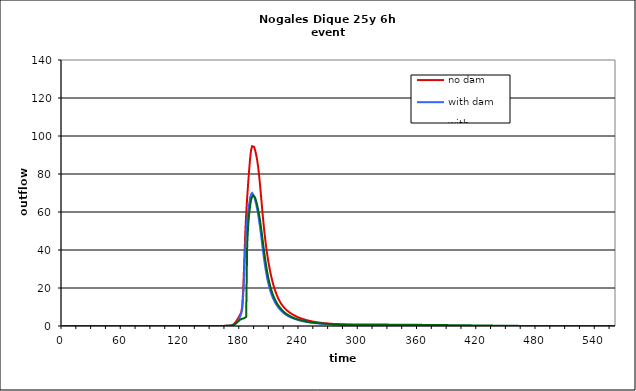
| Category | no dam | with dam | with dam/pond |
|---|---|---|---|
| 0.0 | 0 | 0 | 0 |
| 1.0 | 0 | 0 | 0 |
| 2.0 | 0 | 0 | 0 |
| 3.0 | 0 | 0 | 0 |
| 4.0 | 0 | 0 | 0 |
| 5.0 | 0 | 0 | 0 |
| 6.0 | 0 | 0 | 0 |
| 7.0 | 0 | 0 | 0 |
| 8.0 | 0 | 0 | 0 |
| 9.0 | 0 | 0 | 0 |
| 10.0 | 0 | 0 | 0 |
| 11.0 | 0 | 0 | 0 |
| 12.0 | 0 | 0 | 0 |
| 13.0 | 0 | 0 | 0 |
| 14.0 | 0 | 0 | 0 |
| 15.0 | 0 | 0 | 0 |
| 16.0 | 0 | 0 | 0 |
| 17.0 | 0 | 0 | 0 |
| 18.0 | 0 | 0 | 0 |
| 19.0 | 0 | 0 | 0 |
| 20.0 | 0 | 0 | 0 |
| 21.0 | 0 | 0 | 0 |
| 22.0 | 0 | 0 | 0 |
| 23.0 | 0 | 0 | 0 |
| 24.0 | 0 | 0 | 0 |
| 25.0 | 0 | 0 | 0 |
| 26.0 | 0 | 0 | 0 |
| 27.0 | 0 | 0 | 0 |
| 28.0 | 0 | 0 | 0 |
| 29.0 | 0 | 0 | 0 |
| 30.0 | 0 | 0 | 0 |
| 31.0 | 0 | 0 | 0 |
| 32.0 | 0 | 0 | 0 |
| 33.0 | 0 | 0 | 0 |
| 34.0 | 0 | 0 | 0 |
| 35.0 | 0 | 0 | 0 |
| 36.0 | 0 | 0 | 0 |
| 37.0 | 0 | 0 | 0 |
| 38.0 | 0 | 0 | 0 |
| 39.0 | 0 | 0 | 0 |
| 40.0 | 0 | 0 | 0 |
| 41.0 | 0 | 0 | 0 |
| 42.0 | 0 | 0 | 0 |
| 43.0 | 0 | 0 | 0 |
| 44.0 | 0 | 0 | 0 |
| 45.0 | 0 | 0 | 0 |
| 46.0 | 0 | 0 | 0 |
| 47.0 | 0 | 0 | 0 |
| 48.0 | 0 | 0 | 0 |
| 49.0 | 0 | 0 | 0 |
| 50.0 | 0 | 0 | 0 |
| 51.0 | 0 | 0 | 0 |
| 52.0 | 0 | 0 | 0 |
| 53.0 | 0 | 0 | 0 |
| 54.0 | 0 | 0 | 0 |
| 55.0 | 0 | 0 | 0 |
| 56.0 | 0 | 0 | 0 |
| 57.0 | 0 | 0 | 0 |
| 58.0 | 0 | 0 | 0 |
| 59.0 | 0 | 0 | 0 |
| 60.0 | 0 | 0 | 0 |
| 61.0 | 0 | 0 | 0 |
| 62.0 | 0 | 0 | 0 |
| 63.0 | 0 | 0 | 0 |
| 64.0 | 0 | 0 | 0 |
| 65.0 | 0 | 0 | 0 |
| 66.0 | 0 | 0 | 0 |
| 67.0 | 0 | 0 | 0 |
| 68.0 | 0 | 0 | 0 |
| 69.0 | 0 | 0 | 0 |
| 70.0 | 0 | 0 | 0 |
| 71.0 | 0 | 0 | 0 |
| 72.0 | 0 | 0 | 0 |
| 73.0 | 0 | 0 | 0 |
| 74.0 | 0 | 0 | 0 |
| 75.0 | 0 | 0 | 0 |
| 76.0 | 0 | 0 | 0 |
| 77.0 | 0 | 0 | 0 |
| 78.0 | 0 | 0 | 0 |
| 79.0 | 0 | 0 | 0 |
| 80.0 | 0 | 0 | 0 |
| 81.0 | 0 | 0 | 0 |
| 82.0 | 0 | 0 | 0 |
| 83.0 | 0 | 0 | 0 |
| 84.0 | 0 | 0 | 0 |
| 85.0 | 0 | 0 | 0 |
| 86.0 | 0 | 0 | 0 |
| 87.0 | 0 | 0 | 0 |
| 88.0 | 0 | 0 | 0 |
| 89.0 | 0 | 0 | 0 |
| 90.0 | 0 | 0 | 0 |
| 91.0 | 0 | 0 | 0 |
| 92.0 | 0 | 0 | 0 |
| 93.0 | 0 | 0 | 0 |
| 94.0 | 0 | 0 | 0 |
| 95.0 | 0 | 0 | 0 |
| 96.0 | 0 | 0 | 0 |
| 97.0 | 0 | 0 | 0 |
| 98.0 | 0 | 0 | 0 |
| 99.0 | 0 | 0 | 0 |
| 100.0 | 0 | 0 | 0 |
| 101.0 | 0 | 0 | 0 |
| 102.0 | 0 | 0 | 0 |
| 103.0 | 0 | 0 | 0 |
| 104.0 | 0 | 0 | 0 |
| 105.0 | 0 | 0 | 0 |
| 106.0 | 0 | 0 | 0 |
| 107.0 | 0 | 0 | 0 |
| 108.0 | 0 | 0 | 0 |
| 109.0 | 0 | 0 | 0 |
| 110.0 | 0 | 0 | 0 |
| 111.0 | 0 | 0 | 0 |
| 112.0 | 0 | 0 | 0 |
| 113.0 | 0 | 0 | 0 |
| 114.0 | 0 | 0 | 0 |
| 115.0 | 0 | 0 | 0 |
| 116.0 | 0 | 0 | 0 |
| 117.0 | 0 | 0 | 0 |
| 118.0 | 0 | 0 | 0 |
| 119.0 | 0 | 0 | 0 |
| 120.0 | 0 | 0 | 0 |
| 121.0 | 0 | 0 | 0 |
| 122.0 | 0 | 0 | 0 |
| 123.0 | 0 | 0 | 0 |
| 124.0 | 0 | 0 | 0 |
| 125.0 | 0 | 0 | 0 |
| 126.0 | 0 | 0 | 0 |
| 127.0 | 0 | 0 | 0 |
| 128.0 | 0 | 0 | 0 |
| 129.0 | 0 | 0 | 0 |
| 130.0 | 0 | 0 | 0 |
| 131.0 | 0 | 0 | 0 |
| 132.0 | 0 | 0 | 0 |
| 133.0 | 0 | 0 | 0 |
| 134.0 | 0 | 0 | 0 |
| 135.0 | 0 | 0 | 0 |
| 136.0 | 0 | 0 | 0 |
| 137.0 | 0 | 0 | 0 |
| 138.0 | 0 | 0 | 0 |
| 139.0 | 0 | 0 | 0 |
| 140.0 | 0 | 0 | 0 |
| 141.0 | 0 | 0 | 0 |
| 142.0 | 0 | 0 | 0 |
| 143.0 | 0 | 0 | 0 |
| 144.0 | 0 | 0 | 0 |
| 145.0 | 0.001 | 0 | 0 |
| 146.0 | 0.001 | 0 | 0 |
| 147.0 | 0.001 | 0 | 0 |
| 148.0 | 0.002 | 0 | 0 |
| 149.0 | 0.003 | 0 | 0 |
| 150.0 | 0.003 | 0.001 | 0.001 |
| 151.0 | 0.005 | 0.001 | 0.001 |
| 152.0 | 0.006 | 0.001 | 0.001 |
| 153.0 | 0.008 | 0.002 | 0.002 |
| 154.0 | 0.011 | 0.003 | 0.003 |
| 155.0 | 0.013 | 0.004 | 0.004 |
| 156.0 | 0.017 | 0.005 | 0.005 |
| 157.0 | 0.021 | 0.007 | 0.007 |
| 158.0 | 0.025 | 0.009 | 0.009 |
| 159.0 | 0.029 | 0.012 | 0.012 |
| 160.0 | 0.034 | 0.015 | 0.015 |
| 161.0 | 0.04 | 0.019 | 0.019 |
| 162.0 | 0.048 | 0.024 | 0.024 |
| 163.0 | 0.059 | 0.032 | 0.032 |
| 164.0 | 0.073 | 0.041 | 0.041 |
| 165.0 | 0.09 | 0.053 | 0.053 |
| 166.0 | 0.11 | 0.068 | 0.068 |
| 167.0 | 0.135 | 0.085 | 0.085 |
| 168.0 | 0.164 | 0.105 | 0.105 |
| 169.0 | 0.196 | 0.127 | 0.127 |
| 170.0 | 0.232 | 0.151 | 0.151 |
| 171.0 | 0.305 | 0.199 | 0.198 |
| 172.0 | 0.472 | 0.303 | 0.302 |
| 173.0 | 0.782 | 0.482 | 0.48 |
| 174.0 | 1.265 | 0.753 | 0.738 |
| 175.0 | 1.886 | 1.13 | 1.086 |
| 176.0 | 2.583 | 1.608 | 1.513 |
| 177.0 | 3.363 | 2.16 | 1.986 |
| 178.0 | 4.226 | 2.829 | 2.483 |
| 179.0 | 5.14 | 3.818 | 2.969 |
| 180.0 | 6.116 | 5.204 | 3.37 |
| 181.0 | 6.999 | 6.637 | 3.648 |
| 182.0 | 10.349 | 9.035 | 3.838 |
| 183.0 | 18.929 | 16.034 | 3.978 |
| 184.0 | 32.876 | 27.003 | 4.081 |
| 185.0 | 47.768 | 40.527 | 4.071 |
| 186.0 | 58.897 | 49.934 | 4.829 |
| 187.0 | 67.423 | 55.668 | 42.446 |
| 188.0 | 74.99 | 60.136 | 52.744 |
| 189.0 | 82.029 | 64.124 | 58.798 |
| 190.0 | 88.201 | 67.394 | 63.308 |
| 191.0 | 92.567 | 69.394 | 66.426 |
| 192.0 | 94.669 | 70.03 | 68.092 |
| 193.0 | 95.088 | 69.653 | 68.709 |
| 194.0 | 94.289 | 68.478 | 68.522 |
| 195.0 | 92.58 | 66.613 | 67.547 |
| 196.0 | 90.428 | 64.378 | 65.927 |
| 197.0 | 87.739 | 61.942 | 63.901 |
| 198.0 | 84.241 | 59.161 | 61.549 |
| 199.0 | 79.788 | 55.914 | 58.773 |
| 200.0 | 74.496 | 52.212 | 55.582 |
| 201.0 | 68.692 | 48.145 | 51.98 |
| 202.0 | 62.762 | 43.901 | 48.006 |
| 203.0 | 57.043 | 39.705 | 43.917 |
| 204.0 | 51.758 | 35.734 | 39.892 |
| 205.0 | 46.965 | 32.092 | 36.054 |
| 206.0 | 42.663 | 28.821 | 32.527 |
| 207.0 | 38.818 | 25.929 | 29.318 |
| 208.0 | 35.379 | 23.393 | 26.451 |
| 209.0 | 32.29 | 21.191 | 23.943 |
| 210.0 | 29.51 | 19.275 | 21.714 |
| 211.0 | 26.995 | 17.603 | 19.796 |
| 212.0 | 24.719 | 16.13 | 18.107 |
| 213.0 | 22.663 | 14.826 | 16.575 |
| 214.0 | 20.809 | 13.673 | 15.245 |
| 215.0 | 19.135 | 12.647 | 14.096 |
| 216.0 | 17.626 | 11.731 | 13.048 |
| 217.0 | 16.268 | 10.908 | 12.083 |
| 218.0 | 15.047 | 10.159 | 11.231 |
| 219.0 | 13.957 | 9.473 | 10.481 |
| 220.0 | 12.978 | 8.842 | 9.806 |
| 221.0 | 12.098 | 8.261 | 9.18 |
| 222.0 | 11.306 | 7.728 | 8.575 |
| 223.0 | 10.591 | 7.238 | 8 |
| 224.0 | 9.946 | 6.791 | 7.484 |
| 225.0 | 9.362 | 6.382 | 7.029 |
| 226.0 | 8.83 | 6.009 | 6.622 |
| 227.0 | 8.344 | 5.669 | 6.254 |
| 228.0 | 7.896 | 5.359 | 5.92 |
| 229.0 | 7.482 | 5.076 | 5.614 |
| 230.0 | 7.097 | 4.817 | 5.331 |
| 231.0 | 6.737 | 4.577 | 5.045 |
| 232.0 | 6.398 | 4.352 | 4.767 |
| 233.0 | 6.079 | 4.141 | 4.516 |
| 234.0 | 5.779 | 3.942 | 4.291 |
| 235.0 | 5.497 | 3.753 | 4.086 |
| 236.0 | 5.231 | 3.574 | 3.896 |
| 237.0 | 4.982 | 3.403 | 3.719 |
| 238.0 | 4.747 | 3.242 | 3.552 |
| 239.0 | 4.526 | 3.089 | 3.394 |
| 240.0 | 4.318 | 2.944 | 3.245 |
| 241.0 | 4.122 | 2.807 | 3.104 |
| 242.0 | 3.936 | 2.678 | 2.969 |
| 243.0 | 3.759 | 2.556 | 2.842 |
| 244.0 | 3.59 | 2.441 | 2.722 |
| 245.0 | 3.43 | 2.332 | 2.608 |
| 246.0 | 3.277 | 2.23 | 2.5 |
| 247.0 | 3.131 | 2.135 | 2.397 |
| 248.0 | 2.993 | 2.045 | 2.296 |
| 249.0 | 2.861 | 1.963 | 2.197 |
| 250.0 | 2.736 | 1.886 | 2.103 |
| 251.0 | 2.617 | 1.814 | 2.016 |
| 252.0 | 2.503 | 1.746 | 1.938 |
| 253.0 | 2.395 | 1.68 | 1.865 |
| 254.0 | 2.293 | 1.618 | 1.798 |
| 255.0 | 2.198 | 1.559 | 1.734 |
| 256.0 | 2.109 | 1.503 | 1.674 |
| 257.0 | 2.026 | 1.451 | 1.617 |
| 258.0 | 1.948 | 1.401 | 1.564 |
| 259.0 | 1.873 | 1.353 | 1.513 |
| 260.0 | 1.803 | 1.308 | 1.464 |
| 261.0 | 1.736 | 1.266 | 1.418 |
| 262.0 | 1.672 | 1.225 | 1.374 |
| 263.0 | 1.611 | 1.185 | 1.332 |
| 264.0 | 1.553 | 1.147 | 1.292 |
| 265.0 | 1.498 | 1.111 | 1.253 |
| 266.0 | 1.445 | 1.075 | 1.216 |
| 267.0 | 1.395 | 1.041 | 1.18 |
| 268.0 | 1.347 | 1.008 | 1.145 |
| 269.0 | 1.302 | 0.976 | 1.112 |
| 270.0 | 1.258 | 0.945 | 1.079 |
| 271.0 | 1.216 | 0.916 | 1.048 |
| 272.0 | 1.176 | 0.888 | 1.019 |
| 273.0 | 1.137 | 0.86 | 0.99 |
| 274.0 | 1.099 | 0.834 | 0.962 |
| 275.0 | 1.063 | 0.809 | 0.935 |
| 276.0 | 1.028 | 0.785 | 0.91 |
| 277.0 | 0.994 | 0.761 | 0.889 |
| 278.0 | 0.962 | 0.739 | 0.873 |
| 279.0 | 0.93 | 0.717 | 0.862 |
| 280.0 | 0.9 | 0.696 | 0.856 |
| 281.0 | 0.871 | 0.676 | 0.852 |
| 282.0 | 0.842 | 0.656 | 0.849 |
| 283.0 | 0.815 | 0.637 | 0.847 |
| 284.0 | 0.789 | 0.619 | 0.845 |
| 285.0 | 0.764 | 0.601 | 0.842 |
| 286.0 | 0.739 | 0.583 | 0.84 |
| 287.0 | 0.716 | 0.566 | 0.838 |
| 288.0 | 0.693 | 0.55 | 0.836 |
| 289.0 | 0.671 | 0.534 | 0.833 |
| 290.0 | 0.65 | 0.519 | 0.831 |
| 291.0 | 0.63 | 0.505 | 0.829 |
| 292.0 | 0.611 | 0.491 | 0.826 |
| 293.0 | 0.592 | 0.477 | 0.824 |
| 294.0 | 0.573 | 0.464 | 0.821 |
| 295.0 | 0.556 | 0.451 | 0.819 |
| 296.0 | 0.539 | 0.439 | 0.816 |
| 297.0 | 0.522 | 0.427 | 0.814 |
| 298.0 | 0.506 | 0.416 | 0.811 |
| 299.0 | 0.491 | 0.404 | 0.809 |
| 300.0 | 0.476 | 0.393 | 0.806 |
| 301.0 | 0.462 | 0.383 | 0.803 |
| 302.0 | 0.448 | 0.372 | 0.801 |
| 303.0 | 0.434 | 0.363 | 0.798 |
| 304.0 | 0.422 | 0.353 | 0.796 |
| 305.0 | 0.409 | 0.344 | 0.793 |
| 306.0 | 0.397 | 0.335 | 0.79 |
| 307.0 | 0.385 | 0.326 | 0.788 |
| 308.0 | 0.374 | 0.318 | 0.785 |
| 309.0 | 0.363 | 0.31 | 0.783 |
| 310.0 | 0.353 | 0.302 | 0.78 |
| 311.0 | 0.342 | 0.294 | 0.777 |
| 312.0 | 0.333 | 0.287 | 0.775 |
| 313.0 | 0.323 | 0.28 | 0.772 |
| 314.0 | 0.314 | 0.273 | 0.77 |
| 315.0 | 0.305 | 0.266 | 0.767 |
| 316.0 | 0.296 | 0.259 | 0.764 |
| 317.0 | 0.288 | 0.253 | 0.762 |
| 318.0 | 0.28 | 0.247 | 0.759 |
| 319.0 | 0.272 | 0.241 | 0.756 |
| 320.0 | 0.264 | 0.235 | 0.753 |
| 321.0 | 0.257 | 0.229 | 0.75 |
| 322.0 | 0.25 | 0.224 | 0.747 |
| 323.0 | 0.243 | 0.219 | 0.745 |
| 324.0 | 0.236 | 0.213 | 0.742 |
| 325.0 | 0.23 | 0.208 | 0.739 |
| 326.0 | 0.223 | 0.203 | 0.736 |
| 327.0 | 0.217 | 0.199 | 0.733 |
| 328.0 | 0.211 | 0.194 | 0.73 |
| 329.0 | 0.206 | 0.19 | 0.726 |
| 330.0 | 0.2 | 0.185 | 0.723 |
| 331.0 | 0.195 | 0.181 | 0.72 |
| 332.0 | 0.189 | 0.177 | 0.717 |
| 333.0 | 0.184 | 0.173 | 0.714 |
| 334.0 | 0.179 | 0.169 | 0.711 |
| 335.0 | 0.175 | 0.165 | 0.707 |
| 336.0 | 0.17 | 0.161 | 0.704 |
| 337.0 | 0.166 | 0.158 | 0.701 |
| 338.0 | 0.161 | 0.154 | 0.697 |
| 339.0 | 0.157 | 0.151 | 0.694 |
| 340.0 | 0.153 | 0.148 | 0.691 |
| 341.0 | 0.149 | 0.145 | 0.687 |
| 342.0 | 0.145 | 0.142 | 0.684 |
| 343.0 | 0.141 | 0.139 | 0.68 |
| 344.0 | 0.137 | 0.136 | 0.677 |
| 345.0 | 0.134 | 0.133 | 0.673 |
| 346.0 | 0.13 | 0.13 | 0.669 |
| 347.0 | 0.127 | 0.128 | 0.666 |
| 348.0 | 0.124 | 0.125 | 0.662 |
| 349.0 | 0.121 | 0.122 | 0.658 |
| 350.0 | 0.118 | 0.12 | 0.654 |
| 351.0 | 0.115 | 0.118 | 0.65 |
| 352.0 | 0.112 | 0.115 | 0.646 |
| 353.0 | 0.109 | 0.113 | 0.642 |
| 354.0 | 0.106 | 0.111 | 0.637 |
| 355.0 | 0.103 | 0.109 | 0.633 |
| 356.0 | 0.101 | 0.106 | 0.628 |
| 357.0 | 0.098 | 0.104 | 0.624 |
| 358.0 | 0.096 | 0.102 | 0.619 |
| 359.0 | 0.094 | 0.101 | 0.615 |
| 360.0 | 0.091 | 0.099 | 0.61 |
| 361.0 | 0.089 | 0.097 | 0.606 |
| 362.0 | 0.087 | 0.095 | 0.601 |
| 363.0 | 0.085 | 0.093 | 0.597 |
| 364.0 | 0.083 | 0.092 | 0.592 |
| 365.0 | 0.081 | 0.09 | 0.587 |
| 366.0 | 0.079 | 0.088 | 0.583 |
| 367.0 | 0.077 | 0.087 | 0.578 |
| 368.0 | 0.075 | 0.085 | 0.573 |
| 369.0 | 0.073 | 0.084 | 0.568 |
| 370.0 | 0.071 | 0.082 | 0.564 |
| 371.0 | 0.07 | 0.081 | 0.559 |
| 372.0 | 0.068 | 0.079 | 0.554 |
| 373.0 | 0.066 | 0.078 | 0.549 |
| 374.0 | 0.065 | 0.077 | 0.545 |
| 375.0 | 0.063 | 0.075 | 0.54 |
| 376.0 | 0.062 | 0.074 | 0.535 |
| 377.0 | 0.06 | 0.073 | 0.53 |
| 378.0 | 0.059 | 0.072 | 0.525 |
| 379.0 | 0.058 | 0.07 | 0.52 |
| 380.0 | 0.056 | 0.069 | 0.515 |
| 381.0 | 0.055 | 0.068 | 0.51 |
| 382.0 | 0.054 | 0.067 | 0.505 |
| 383.0 | 0.052 | 0.066 | 0.5 |
| 384.0 | 0.051 | 0.065 | 0.495 |
| 385.0 | 0.05 | 0.064 | 0.49 |
| 386.0 | 0.049 | 0.063 | 0.485 |
| 387.0 | 0.048 | 0.062 | 0.48 |
| 388.0 | 0.047 | 0.061 | 0.474 |
| 389.0 | 0.046 | 0.06 | 0.469 |
| 390.0 | 0.045 | 0.059 | 0.463 |
| 391.0 | 0.044 | 0.058 | 0.458 |
| 392.0 | 0.043 | 0.057 | 0.452 |
| 393.0 | 0.042 | 0.057 | 0.447 |
| 394.0 | 0.041 | 0.056 | 0.441 |
| 395.0 | 0.04 | 0.055 | 0.435 |
| 396.0 | 0.039 | 0.054 | 0.43 |
| 397.0 | 0.038 | 0.053 | 0.424 |
| 398.0 | 0.037 | 0.053 | 0.419 |
| 399.0 | 0.037 | 0.052 | 0.413 |
| 400.0 | 0.036 | 0.051 | 0.407 |
| 401.0 | 0.035 | 0.05 | 0.402 |
| 402.0 | 0.034 | 0.05 | 0.396 |
| 403.0 | 0.034 | 0.049 | 0.39 |
| 404.0 | 0.033 | 0.048 | 0.384 |
| 405.0 | 0.032 | 0.047 | 0.379 |
| 406.0 | 0.031 | 0.047 | 0.373 |
| 407.0 | 0.031 | 0.046 | 0.367 |
| 408.0 | 0.03 | 0.045 | 0.362 |
| 409.0 | 0.03 | 0.045 | 0.356 |
| 410.0 | 0.029 | 0.044 | 0.35 |
| 411.0 | 0.028 | 0.044 | 0.344 |
| 412.0 | 0.028 | 0.043 | 0.339 |
| 413.0 | 0.027 | 0.042 | 0.333 |
| 414.0 | 0.027 | 0.042 | 0.327 |
| 415.0 | 0.026 | 0.041 | 0.321 |
| 416.0 | 0.025 | 0.041 | 0.316 |
| 417.0 | 0.025 | 0.04 | 0.31 |
| 418.0 | 0.024 | 0.04 | 0.304 |
| 419.0 | 0.024 | 0.039 | 0.298 |
| 420.0 | 0.023 | 0.038 | 0.292 |
| 421.0 | 0.023 | 0.038 | 0.285 |
| 422.0 | 0.022 | 0.037 | 0.279 |
| 423.0 | 0.022 | 0.037 | 0.273 |
| 424.0 | 0.021 | 0.036 | 0.267 |
| 425.0 | 0.021 | 0.036 | 0.261 |
| 426.0 | 0.021 | 0.036 | 0.255 |
| 427.0 | 0.02 | 0.035 | 0.249 |
| 428.0 | 0.02 | 0.035 | 0.243 |
| 429.0 | 0.019 | 0.034 | 0.237 |
| 430.0 | 0.019 | 0.034 | 0.231 |
| 431.0 | 0.018 | 0.033 | 0.225 |
| 432.0 | 0.018 | 0.033 | 0.22 |
| 433.0 | 0.018 | 0.033 | 0.214 |
| 434.0 | 0.017 | 0.032 | 0.208 |
| 435.0 | 0.017 | 0.032 | 0.202 |
| 436.0 | 0.017 | 0.031 | 0.197 |
| 437.0 | 0.016 | 0.031 | 0.191 |
| 438.0 | 0.016 | 0.031 | 0.186 |
| 439.0 | 0.016 | 0.03 | 0.18 |
| 440.0 | 0.015 | 0.03 | 0.175 |
| 441.0 | 0.015 | 0.03 | 0.169 |
| 442.0 | 0.015 | 0.029 | 0.164 |
| 443.0 | 0.014 | 0.029 | 0.158 |
| 444.0 | 0.014 | 0.028 | 0.152 |
| 445.0 | 0.014 | 0.028 | 0.146 |
| 446.0 | 0.013 | 0.028 | 0.14 |
| 447.0 | 0.013 | 0.027 | 0.134 |
| 448.0 | 0.013 | 0.027 | 0.128 |
| 449.0 | 0.012 | 0.027 | 0.122 |
| 450.0 | 0.012 | 0.026 | 0.116 |
| 451.0 | 0.012 | 0.026 | 0.11 |
| 452.0 | 0.011 | 0.026 | 0.105 |
| 453.0 | 0.011 | 0.025 | 0.099 |
| 454.0 | 0.011 | 0.025 | 0.094 |
| 455.0 | 0.01 | 0.025 | 0.089 |
| 456.0 | 0.01 | 0.024 | 0.085 |
| 457.0 | 0.01 | 0.024 | 0.08 |
| 458.0 | 0.01 | 0.024 | 0.076 |
| 459.0 | 0.009 | 0.023 | 0.073 |
| 460.0 | 0.009 | 0.023 | 0.069 |
| 461.0 | 0.009 | 0.022 | 0.066 |
| 462.0 | 0.009 | 0.022 | 0.063 |
| 463.0 | 0.008 | 0.022 | 0.06 |
| 464.0 | 0.008 | 0.021 | 0.057 |
| 465.0 | 0.008 | 0.021 | 0.054 |
| 466.0 | 0.008 | 0.02 | 0.052 |
| 467.0 | 0.007 | 0.02 | 0.05 |
| 468.0 | 0.007 | 0.02 | 0.047 |
| 469.0 | 0.007 | 0.019 | 0.045 |
| 470.0 | 0.007 | 0.019 | 0.043 |
| 471.0 | 0.006 | 0.018 | 0.041 |
| 472.0 | 0.006 | 0.018 | 0.04 |
| 473.0 | 0.006 | 0.018 | 0.038 |
| 474.0 | 0.006 | 0.017 | 0.036 |
| 475.0 | 0.005 | 0.017 | 0.035 |
| 476.0 | 0.005 | 0.016 | 0.034 |
| 477.0 | 0.005 | 0.016 | 0.032 |
| 478.0 | 0.005 | 0.016 | 0.031 |
| 479.0 | 0.005 | 0.015 | 0.03 |
| 480.0 | 0.004 | 0.015 | 0.029 |
| 481.0 | 0.004 | 0.015 | 0.028 |
| 482.0 | 0.004 | 0.014 | 0.027 |
| 483.0 | 0.004 | 0.014 | 0.026 |
| 484.0 | 0.004 | 0.014 | 0.025 |
| 485.0 | 0.003 | 0.013 | 0.024 |
| 486.0 | 0.003 | 0.013 | 0.023 |
| 487.0 | 0.003 | 0.013 | 0.022 |
| 488.0 | 0.003 | 0.012 | 0.021 |
| 489.0 | 0.003 | 0.012 | 0.021 |
| 490.0 | 0.003 | 0.012 | 0.02 |
| 491.0 | 0.002 | 0.011 | 0.019 |
| 492.0 | 0.002 | 0.011 | 0.019 |
| 493.0 | 0.002 | 0.011 | 0.018 |
| 494.0 | 0.002 | 0.011 | 0.017 |
| 495.0 | 0.002 | 0.01 | 0.017 |
| 496.0 | 0.002 | 0.01 | 0.016 |
| 497.0 | 0.002 | 0.01 | 0.016 |
| 498.0 | 0.001 | 0.009 | 0.015 |
| 499.0 | 0.001 | 0.009 | 0.015 |
| 500.0 | 0.001 | 0.009 | 0.014 |
| 501.0 | 0.001 | 0.009 | 0.014 |
| 502.0 | 0.001 | 0.008 | 0.014 |
| 503.0 | 0.001 | 0.008 | 0.013 |
| 504.0 | 0.001 | 0.008 | 0.013 |
| 505.0 | 0.001 | 0.008 | 0.012 |
| 506.0 | 0.001 | 0.008 | 0.012 |
| 507.0 | 0.001 | 0.007 | 0.012 |
| 508.0 | 0.001 | 0.007 | 0.011 |
| 509.0 | 0.001 | 0.007 | 0.011 |
| 510.0 | 0.001 | 0.007 | 0.011 |
| 511.0 | 0 | 0.006 | 0.01 |
| 512.0 | 0 | 0.006 | 0.01 |
| 513.0 | 0 | 0.006 | 0.01 |
| 514.0 | 0 | 0.006 | 0.009 |
| 515.0 | 0 | 0.006 | 0.009 |
| 516.0 | 0 | 0.006 | 0.009 |
| 517.0 | 0 | 0.005 | 0.009 |
| 518.0 | 0 | 0.005 | 0.008 |
| 519.0 | 0 | 0.005 | 0.008 |
| 520.0 | 0 | 0.005 | 0.008 |
| 521.0 | 0 | 0.005 | 0.008 |
| 522.0 | 0 | 0.004 | 0.007 |
| 523.0 | 0 | 0.004 | 0.007 |
| 524.0 | 0 | 0.004 | 0.007 |
| 525.0 | 0 | 0.004 | 0.007 |
| 526.0 | 0 | 0.004 | 0.006 |
| 527.0 | 0 | 0.004 | 0.006 |
| 528.0 | 0 | 0.004 | 0.006 |
| 529.0 | 0 | 0.003 | 0.006 |
| 530.0 | 0 | 0.003 | 0.006 |
| 531.0 | 0 | 0.003 | 0.005 |
| 532.0 | 0 | 0.003 | 0.005 |
| 533.0 | 0 | 0.003 | 0.005 |
| 534.0 | 0 | 0.003 | 0.005 |
| 535.0 | 0 | 0.003 | 0.005 |
| 536.0 | 0 | 0.003 | 0.004 |
| 537.0 | 0 | 0.003 | 0.004 |
| 538.0 | 0 | 0.002 | 0.004 |
| 539.0 | 0 | 0.002 | 0.004 |
| 540.0 | 0 | 0.002 | 0.004 |
| 541.0 | 0 | 0.002 | 0.004 |
| 542.0 | 0 | 0.002 | 0.004 |
| 543.0 | 0 | 0.002 | 0.003 |
| 544.0 | 0 | 0.002 | 0.003 |
| 545.0 | 0 | 0.002 | 0.003 |
| 546.0 | 0 | 0.002 | 0.003 |
| 547.0 | 0 | 0.002 | 0.003 |
| 548.0 | 0 | 0.002 | 0.003 |
| 549.0 | 0 | 0.001 | 0.003 |
| 550.0 | 0 | 0.001 | 0.003 |
| 551.0 | 0 | 0.001 | 0.002 |
| 552.0 | 0 | 0.001 | 0.002 |
| 553.0 | 0 | 0.001 | 0.002 |
| 554.0 | 0 | 0.001 | 0.002 |
| 555.0 | 0 | 0.001 | 0.002 |
| 556.0 | 0 | 0.001 | 0.002 |
| 557.0 | 0 | 0.001 | 0.002 |
| 558.0 | 0 | 0.001 | 0.002 |
| 559.0 | 0 | 0.001 | 0.002 |
| 560.0 | 0 | 0.001 | 0.002 |